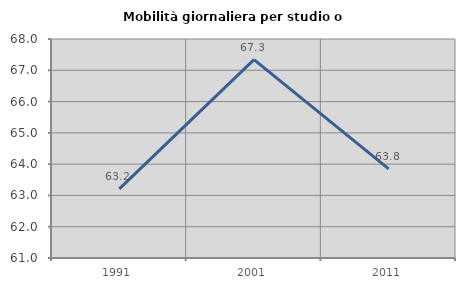
| Category | Mobilità giornaliera per studio o lavoro |
|---|---|
| 1991.0 | 63.21 |
| 2001.0 | 67.343 |
| 2011.0 | 63.85 |